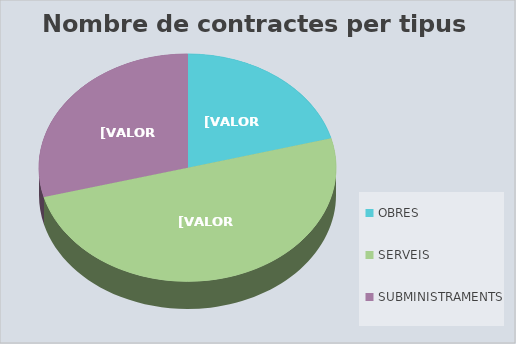
| Category | Series 0 | Series 1 |
|---|---|---|
| OBRES | 5 | 1016117.1 |
| SERVEIS | 12 | 344265.88 |
| SUBMINISTRAMENTS | 7 | 212264.54 |